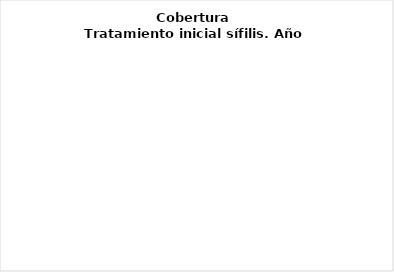
| Category | Series 0 |
|---|---|
| Con tratamiento | 0 |
| Sin tratamiento | 0 |